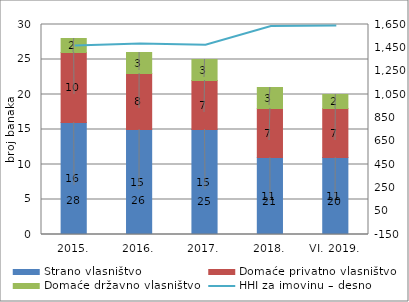
| Category | Strano vlasništvo | Domaće privatno vlasništvo | Domaće državno vlasništvo |
|---|---|---|---|
| 2015. | 16 | 10 | 2 |
| 2016. | 15 | 8 | 3 |
| 2017. | 15 | 7 | 3 |
| 2018. | 11 | 7 | 3 |
| VI. 2019. | 11 | 7 | 2 |